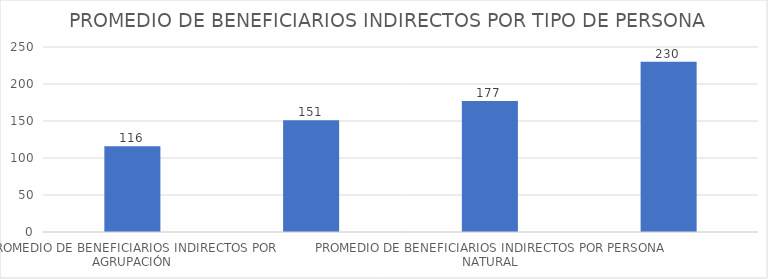
| Category | VALOR |
|---|---|
| PROMEDIO DE BENEFICIARIOS INDIRECTOS POR AGRUPACIÓN | 116 |
| PROMEDIO DE BENEFICIARIOS INDIRECTOS POR GANADOR | 151 |
| PROMEDIO DE BENEFICIARIOS INDIRECTOS POR PERSONA NATURAL | 177 |
| PROMEDIO DE BENEFICIARIOS INDIRECTOS POR PERSONA JURIDICA | 230 |